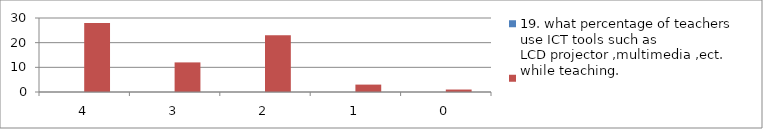
| Category | 19. what percentage of teachers use ICT tools such as
LCD projector ,multimedia ,ect. while teaching. | Series 1 |
|---|---|---|
| 4.0 | 0 | 28 |
| 3.0 | 0 | 12 |
| 2.0 | 0 | 23 |
| 1.0 | 0 | 3 |
| 0.0 | 0 | 1 |